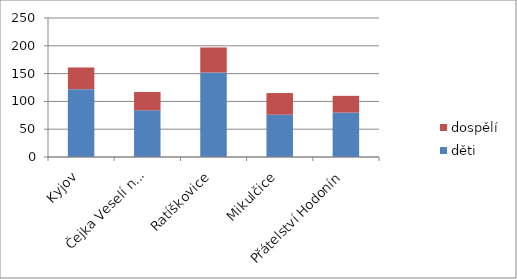
| Category | děti | dospělí |
|---|---|---|
| Kyjov | 122 | 39 |
| Čejka Veselí n.M. | 84 | 33 |
| Ratíškovice | 152 | 45 |
| Mikulčice | 76 | 39 |
| Přátelství Hodonín | 80 | 30 |